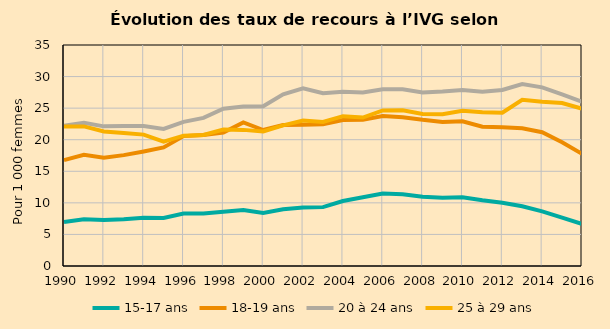
| Category | 15-17 ans | 18-19 ans | 20 à 24 ans | 25 à 29 ans |
|---|---|---|---|---|
| 1990.0 | 6.953 | 16.772 | 22.234 | 22.085 |
| 1991.0 | 7.391 | 17.622 | 22.697 | 22.103 |
| 1992.0 | 7.303 | 17.143 | 22.113 | 21.313 |
| 1993.0 | 7.422 | 17.557 | 22.165 | 21.08 |
| 1994.0 | 7.655 | 18.145 | 22.153 | 20.805 |
| 1995.0 | 7.613 | 18.778 | 21.719 | 19.71 |
| 1996.0 | 8.297 | 20.57 | 22.821 | 20.639 |
| 1997.0 | 8.309 | 20.755 | 23.463 | 20.746 |
| 1998.0 | 8.601 | 21.151 | 24.916 | 21.621 |
| 1999.0 | 8.856 | 22.745 | 25.245 | 21.558 |
| 2000.0 | 8.402 | 21.539 | 25.286 | 21.319 |
| 2001.0 | 8.972 | 22.329 | 27.192 | 22.278 |
| 2002.0 | 9.252 | 22.364 | 28.134 | 23.033 |
| 2003.0 | 9.323 | 22.463 | 27.377 | 22.819 |
| 2004.0 | 10.283 | 23.104 | 27.585 | 23.731 |
| 2005.0 | 10.88 | 23.177 | 27.486 | 23.503 |
| 2006.0 | 11.488 | 23.745 | 27.992 | 24.634 |
| 2007.0 | 11.373 | 23.563 | 27.977 | 24.655 |
| 2008.0 | 10.954 | 23.156 | 27.487 | 24.075 |
| 2009.0 | 10.815 | 22.824 | 27.638 | 24.024 |
| 2010.0 | 10.902 | 22.926 | 27.881 | 24.596 |
| 2011.0 | 10.414 | 22.051 | 27.598 | 24.347 |
| 2012.0 | 10.029 | 21.961 | 27.869 | 24.276 |
| 2013.0 | 9.46 | 21.801 | 28.821 | 26.314 |
| 2014.0 | 8.65 | 21.181 | 28.293 | 26.016 |
| 2015.0 | 7.656 | 19.588 | 27.187 | 25.808 |
| 2016.0 | 6.674 | 17.768 | 26.005 | 24.914 |